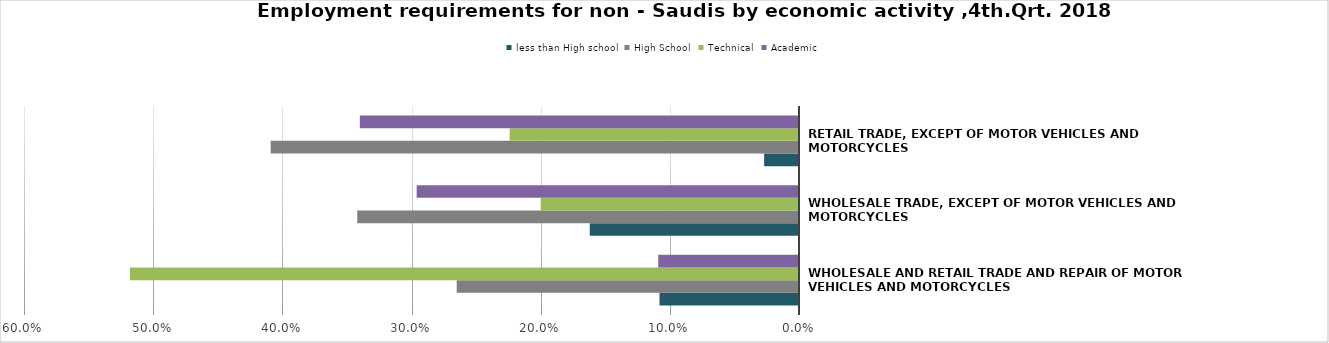
| Category | less than High school | High School | Technical | Academic |
|---|---|---|---|---|
| Wholesale and retail trade and repair of motor vehicles and motorcycles | 0.108 | 0.265 | 0.518 | 0.109 |
| Wholesale trade, except of motor vehicles and motorcycles | 0.162 | 0.342 | 0.2 | 0.296 |
| Retail trade, except of motor vehicles and motorcycles | 0.027 | 0.409 | 0.224 | 0.34 |